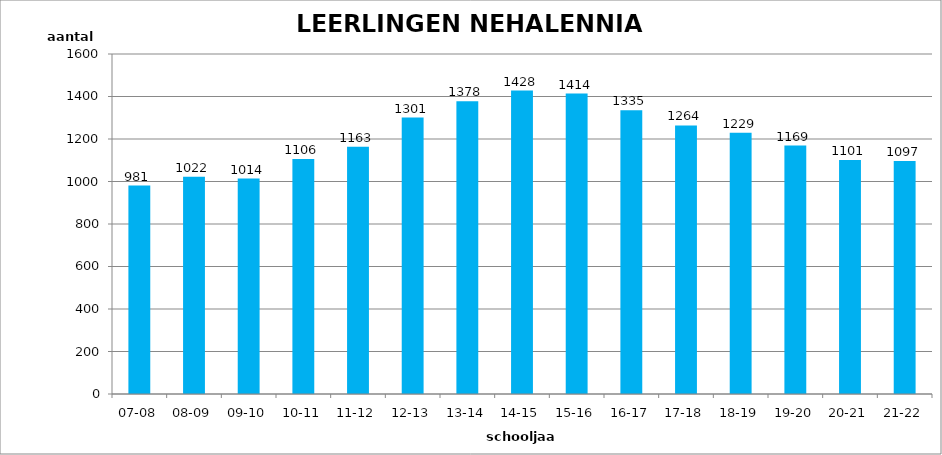
| Category | Series 0 |
|---|---|
| 07-08 | 981 |
| 08-09 | 1022 |
| 09-10 | 1014 |
| 10-11 | 1106 |
| 11-12 | 1163 |
| 12-13 | 1301 |
| 13-14 | 1378 |
| 14-15 | 1428 |
| 15-16 | 1414 |
| 16-17 | 1335 |
| 17-18 | 1264 |
| 18-19 | 1229 |
| 19-20 | 1169 |
| 20-21 | 1101 |
| 21-22 | 1097 |